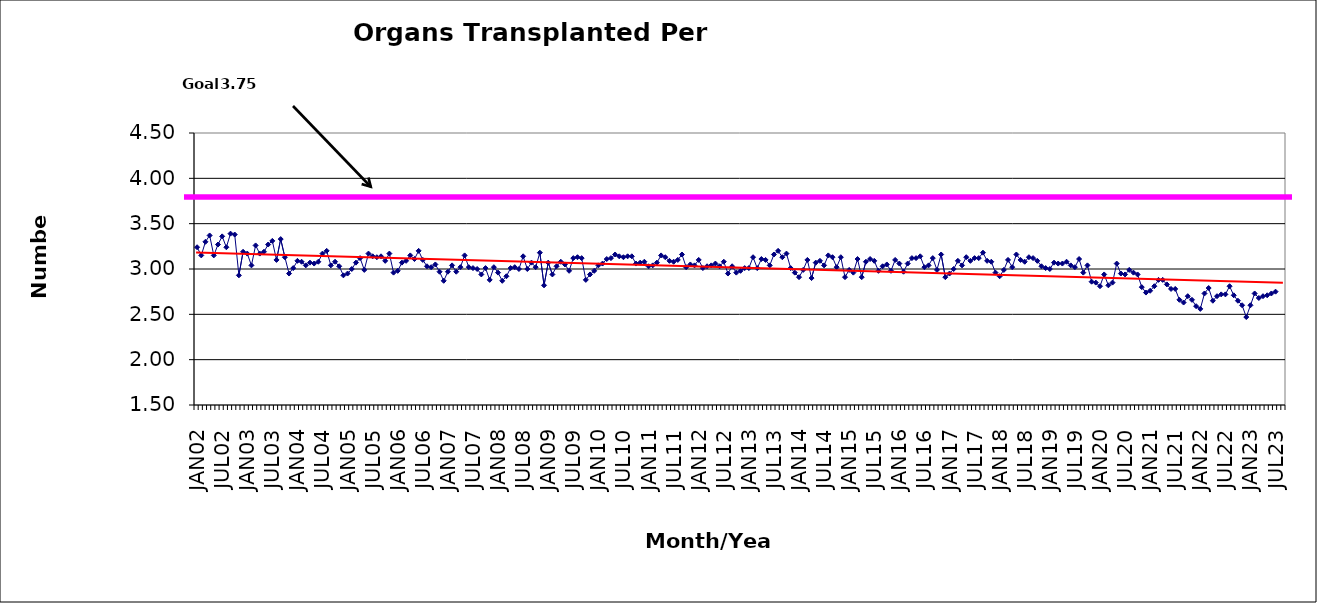
| Category | Series 0 |
|---|---|
| JAN02 | 3.24 |
| FEB02 | 3.15 |
| MAR02 | 3.3 |
| APR02 | 3.37 |
| MAY02 | 3.15 |
| JUN02 | 3.27 |
| JUL02 | 3.36 |
| AUG02 | 3.24 |
| SEP02 | 3.39 |
| OCT02 | 3.38 |
| NOV02 | 2.93 |
| DEC02 | 3.19 |
| JAN03 | 3.17 |
| FEB03 | 3.04 |
| MAR03 | 3.26 |
| APR03 | 3.17 |
| MAY03 | 3.19 |
| JUN03 | 3.27 |
| JUL03 | 3.31 |
| AUG03 | 3.1 |
| SEP03 | 3.33 |
| OCT03 | 3.13 |
| NOV03 | 2.95 |
| DEC03 | 3.01 |
| JAN04 | 3.09 |
| FEB04 | 3.08 |
| MAR04 | 3.04 |
| APR04 | 3.07 |
| MAY04 | 3.06 |
| JUN04 | 3.08 |
| JUL04 | 3.17 |
| AUG04 | 3.2 |
| SEP04 | 3.04 |
| OCT04 | 3.08 |
| NOV04 | 3.03 |
| DEC04 | 2.93 |
| JAN05 | 2.95 |
| FEB05 | 3 |
| MAR05 | 3.07 |
| APR05 | 3.12 |
| MAY05 | 2.99 |
| JUN05 | 3.17 |
| JUL05 | 3.14 |
| AUG05 | 3.13 |
| SEP05 | 3.14 |
| OCT05 | 3.09 |
| NOV05 | 3.17 |
| DEC05 | 2.96 |
| JAN06 | 2.98 |
| FEB06 | 3.07 |
| MAR06 | 3.09 |
| APR06 | 3.15 |
| MAY06 | 3.11 |
| JUN06 | 3.2 |
| JUL06 | 3.1 |
| AUG06 | 3.03 |
| SEP06 | 3.02 |
| OCT06 | 3.05 |
| NOV06 | 2.97 |
| DEC06 | 2.87 |
| JAN07 | 2.97 |
| FEB07 | 3.04 |
| MAR07 | 2.97 |
| APR07 | 3.02 |
| MAY07 | 3.15 |
| JUN07 | 3.02 |
| JUL07 | 3.01 |
| AUG07 | 3 |
| SEP07 | 2.94 |
| OCT07 | 3.01 |
| NOV07 | 2.88 |
| DEC07 | 3.02 |
| JAN08 | 2.96 |
| FEB08 | 2.87 |
| MAR08 | 2.92 |
| APR08 | 3.01 |
| MAY08 | 3.02 |
| JUN08 | 3 |
| JUL08 | 3.14 |
| AUG08 | 3 |
| SEP08 | 3.07 |
| OCT08 | 3.02 |
| NOV08 | 3.18 |
| DEC08 | 2.82 |
| JAN09 | 3.07 |
| FEB09 | 2.94 |
| MAR09 | 3.03 |
| APR09 | 3.08 |
| MAY09 | 3.05 |
| JUN09 | 2.98 |
| JUL09 | 3.12 |
| AUG09 | 3.13 |
| SEP09 | 3.12 |
| OCT09 | 2.88 |
| NOV09 | 2.94 |
| DEC09 | 2.98 |
| JAN10 | 3.04 |
| FEB10 | 3.06 |
| MAR10 | 3.11 |
| APR10 | 3.12 |
| MAY10 | 3.16 |
| JUN10 | 3.14 |
| JUL10 | 3.13 |
| AUG10 | 3.14 |
| SEP10 | 3.14 |
| OCT10 | 3.06 |
| NOV10 | 3.07 |
| DEC10 | 3.08 |
| JAN11 | 3.03 |
| FEB11 | 3.04 |
| MAR11 | 3.07 |
| APR11 | 3.15 |
| MAY11 | 3.13 |
| JUN11 | 3.09 |
| JUL11 | 3.08 |
| AUG11 | 3.1 |
| SEP11 | 3.16 |
| OCT11 | 3.02 |
| NOV11 | 3.05 |
| DEC11 | 3.04 |
| JAN12 | 3.1 |
| FEB12 | 3.01 |
| MAR12 | 3.03 |
| APR12 | 3.04 |
| MAY12 | 3.06 |
| JUN12 | 3.03 |
| JUL12 | 3.08 |
| AUG12 | 2.95 |
| SEP12 | 3.03 |
| OCT12 | 2.96 |
| NOV12 | 2.98 |
| DEC12 | 3.01 |
| JAN13 | 3.01 |
| FEB13 | 3.13 |
| MAR13 | 3.01 |
| APR13 | 3.11 |
| MAY13 | 3.1 |
| JUN13 | 3.04 |
| JUL13 | 3.16 |
| AUG13 | 3.2 |
| SEP13 | 3.13 |
| OCT13 | 3.17 |
| NOV13 | 3.01 |
| DEC13 | 2.96 |
| JAN14 | 2.91 |
| FEB14 | 2.99 |
| MAR14 | 3.1 |
| APR14 | 2.9 |
| MAY14 | 3.07 |
| JUN14 | 3.09 |
| JUL14 | 3.04 |
| AUG14 | 3.15 |
| SEP14 | 3.13 |
| OCT14 | 3.02 |
| NOV14 | 3.13 |
| DEC14 | 2.91 |
| JAN15 | 2.99 |
| FEB15 | 2.96 |
| MAR15 | 3.11 |
| APR15 | 2.91 |
| MAY15 | 3.08 |
| JUN15 | 3.11 |
| JUL15 | 3.09 |
| AUG15 | 2.98 |
| SEP15 | 3.03 |
| OCT15 | 3.05 |
| NOV15 | 2.98 |
| DEC15 | 3.1 |
| JAN16 | 3.06 |
| FEB16 | 2.97 |
| MAR16 | 3.06 |
| APR16 | 3.12 |
| MAY16 | 3.12 |
| JUN16 | 3.14 |
| JUL16 | 3.02 |
| AUG16 | 3.04 |
| SEP16 | 3.12 |
| OCT16 | 2.99 |
| NOV16 | 3.16 |
| DEC16 | 2.91 |
| JAN17 | 2.95 |
| FEB17 | 3 |
| MAR17 | 3.09 |
| APR17 | 3.04 |
| MAY17 | 3.13 |
| JUN17 | 3.09 |
| JUL17 | 3.12 |
| AUG17 | 3.12 |
| SEP17 | 3.18 |
| OCT17 | 3.09 |
| NOV17 | 3.08 |
| DEC17 | 2.96 |
| JAN18 | 2.92 |
| FEB18 | 2.99 |
| MAR18 | 3.1 |
| APR18 | 3.02 |
| MAY18 | 3.16 |
| JUN18 | 3.1 |
| JUL18 | 3.08 |
| AUG18 | 3.13 |
| SEP18 | 3.12 |
| OCT18 | 3.09 |
| NOV18 | 3.03 |
| DEC18 | 3.01 |
| JAN19 | 3 |
| FEB19 | 3.07 |
| MAR19 | 3.06 |
| APR19 | 3.06 |
| MAY19 | 3.08 |
| JUN19 | 3.04 |
| JUL19 | 3.02 |
| AUG19 | 3.11 |
| SEP19 | 2.96 |
| OCT19 | 3.04 |
| NOV19 | 2.86 |
| DEC19 | 2.85 |
| JAN20 | 2.81 |
| FEB20 | 2.94 |
| MAR20 | 2.82 |
| APR20 | 2.85 |
| MAY20 | 3.06 |
| JUN20 | 2.95 |
| JUL20 | 2.94 |
| AUG20 | 2.99 |
| SEP20 | 2.96 |
| OCT20 | 2.94 |
| NOV20 | 2.8 |
| DEC20 | 2.74 |
| JAN21 | 2.76 |
| FEB21 | 2.81 |
| MAR21 | 2.88 |
| APR21 | 2.88 |
| MAY21 | 2.83 |
| JUN21 | 2.78 |
| JUL21 | 2.78 |
| AUG21 | 2.66 |
| SEP21 | 2.63 |
| OCT21 | 2.7 |
| NOV21 | 2.66 |
| DEC21 | 2.59 |
| JAN22 | 2.56 |
| FEB22 | 2.73 |
| MAR22 | 2.79 |
| APR22 | 2.65 |
| MAY22 | 2.7 |
| JUN22 | 2.72 |
| JUL22 | 2.72 |
| AUG22 | 2.81 |
| SEP22 | 2.71 |
| OCT22 | 2.65 |
| NOV22 | 2.6 |
| DEC22 | 2.47 |
| JAN23 | 2.6 |
| FEB23 | 2.73 |
| MAR23 | 2.68 |
| APR23 | 2.7 |
| MAY23 | 2.71 |
| JUN23 | 2.73 |
| JUL23 | 2.75 |